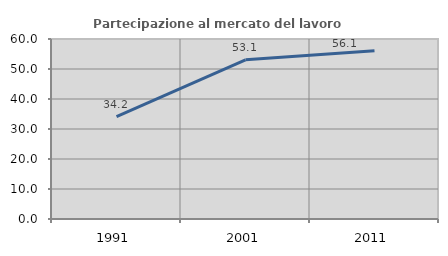
| Category | Partecipazione al mercato del lavoro  femminile |
|---|---|
| 1991.0 | 34.162 |
| 2001.0 | 53.071 |
| 2011.0 | 56.064 |